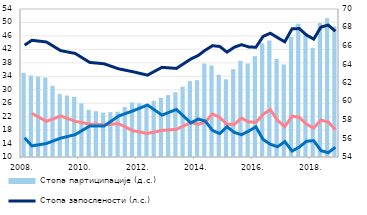
| Category | Стопа партиципације (д.с.) |
|---|---|
| 2008. | 63.1 |
| II | 62.8 |
| III | 62.7 |
| IV | 62.6 |
| 2009. | 61.7 |
| II | 60.8 |
| III | 60.65 |
| IV | 60.5 |
| 2010. | 59.8 |
| II | 59.1 |
| III | 58.95 |
| IV | 58.8 |
| 2011. | 58.85 |
| II | 58.9 |
| III | 59.4 |
| IV | 59.9 |
| 2012. | 59.8 |
| II | 59.7 |
| III | 60.05 |
| IV | 60.4 |
| 2013. | 60.7 |
| II | 61 |
| III | 61.6 |
| IV | 62.2 |
| 2014. | 62.3 |
| II | 64.1 |
| III | 63.9 |
| IV | 62.9 |
| 2015. | 62.4 |
| II | 63.5 |
| III | 64.4 |
| IV | 64.1 |
| 2016. | 64.9 |
| II | 66.3 |
| III | 66.6 |
| IV | 64.6 |
| 2017. | 64 |
| II | 67 |
| III | 68.4 |
| IV | 67.4 |
| 2018. | 65.8 |
| II | 68.5 |
| III | 69 |
| IV | 68.1 |